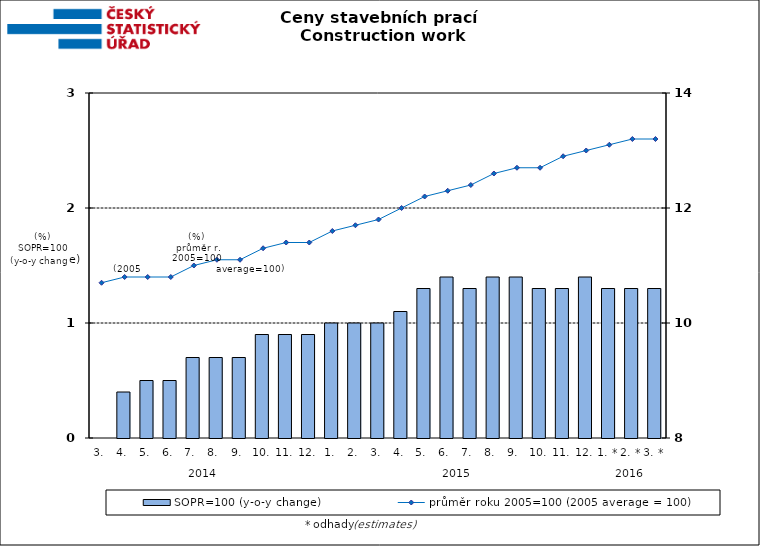
| Category | SOPR=100 (y-o-y change)   |
|---|---|
| 0 | 0 |
| 1 | 0.4 |
| 2 | 0.5 |
| 3 | 0.5 |
| 4 | 0.7 |
| 5 | 0.7 |
| 6 | 0.7 |
| 7 | 0.9 |
| 8 | 0.9 |
| 9 | 0.9 |
| 10 | 1 |
| 11 | 1 |
| 12 | 1 |
| 13 | 1.1 |
| 14 | 1.3 |
| 15 | 1.4 |
| 16 | 1.3 |
| 17 | 1.4 |
| 18 | 1.4 |
| 19 | 1.3 |
| 20 | 1.3 |
| 21 | 1.4 |
| 22 | 1.3 |
| 23 | 1.3 |
| 24 | 1.3 |